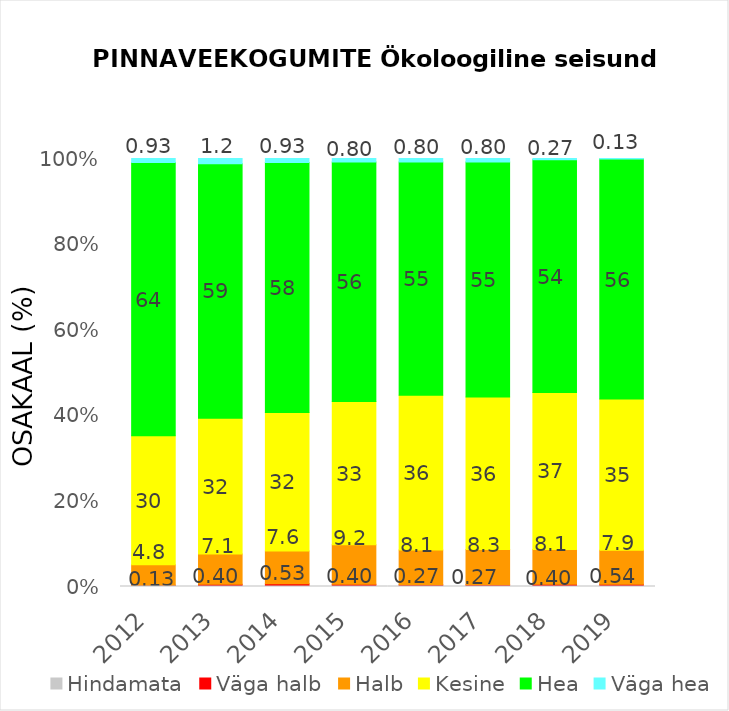
| Category | Hindamata | Väga halb | Halb | Kesine | Hea | Väga hea |
|---|---|---|---|---|---|---|
| 2012.0 | 0.133 | 0.133 | 4.8 | 30.133 | 63.867 | 0.933 |
| 2013.0 | 0.133 | 0.4 | 7.067 | 31.733 | 59.467 | 1.2 |
| 2014.0 | 0.133 | 0.533 | 7.6 | 32.4 | 58.4 | 0.933 |
| 2015.0 | 0.133 | 0.4 | 9.2 | 33.467 | 56 | 0.8 |
| 2016.0 | 0.133 | 0.267 | 8.133 | 36.133 | 54.533 | 0.8 |
| 2017.0 | 0.133 | 0.267 | 8.267 | 35.6 | 54.933 | 0.8 |
| 2018.0 | 0.133 | 0.4 | 8.133 | 36.667 | 54.4 | 0.267 |
| 2019.0 | 0 | 0.538 | 7.93 | 35.349 | 56.048 | 0.134 |